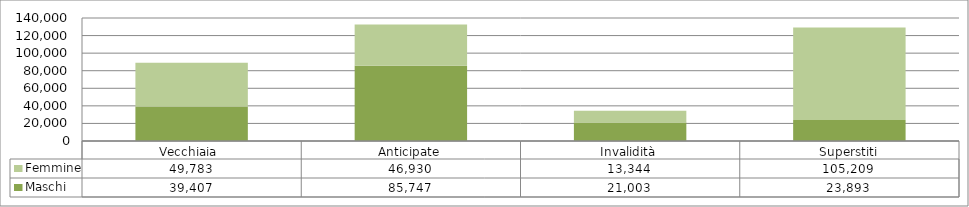
| Category | Maschi | Femmine |
|---|---|---|
| Vecchiaia  | 39407 | 49783 |
| Anticipate | 85747 | 46930 |
| Invalidità | 21003 | 13344 |
| Superstiti | 23893 | 105209 |